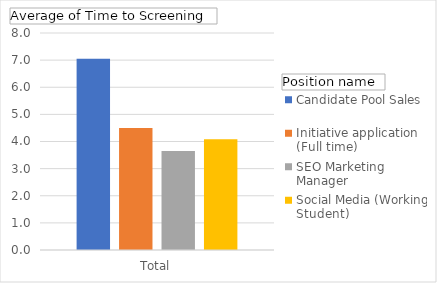
| Category | Candidate Pool Sales | Initiative application (Full time) | SEO Marketing Manager | Social Media (Working Student) |
|---|---|---|---|---|
| Total | 7.053 | 4.5 | 3.647 | 4.087 |